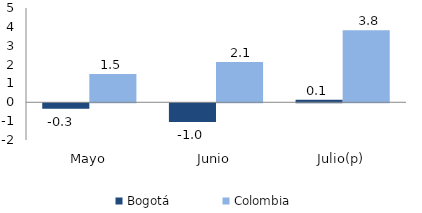
| Category | Bogotá | Colombia |
|---|---|---|
| Mayo | -0.289 | 1.495 |
| Junio | -0.989 | 2.142 |
| Julio(p) | 0.134 | 3.824 |